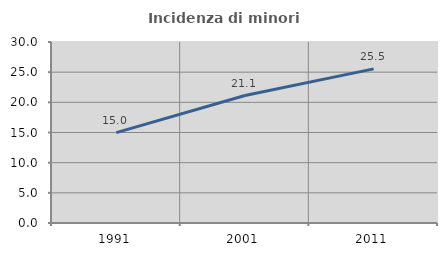
| Category | Incidenza di minori stranieri |
|---|---|
| 1991.0 | 14.973 |
| 2001.0 | 21.127 |
| 2011.0 | 25.545 |